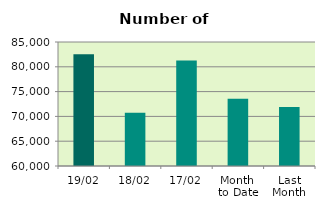
| Category | Series 0 |
|---|---|
| 19/02 | 82516 |
| 18/02 | 70736 |
| 17/02 | 81262 |
| Month 
to Date | 73557.067 |
| Last
Month | 71883.3 |